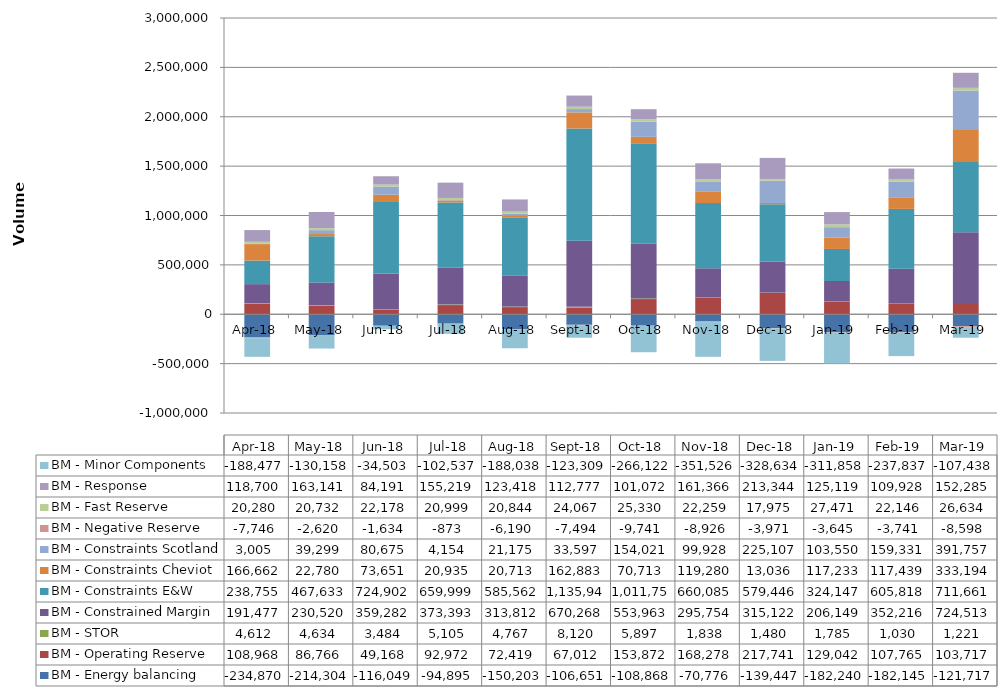
| Category | BM - Energy balancing | BM - Operating Reserve | BM - STOR | BM - Constrained Margin | BM - Constraints E&W | BM - Constraints Cheviot | BM - Constraints Scotland | BM - Negative Reserve | BM - Fast Reserve | BM - Response | BM - Minor Components |
|---|---|---|---|---|---|---|---|---|---|---|---|
| 2018-04-30 | -234870.387 | 108968.126 | 4612.492 | 191477.044 | 238755.119 | 166661.801 | 3005.42 | -7746.036 | 20279.763 | 118700.29 | -188477.184 |
| 2018-05-31 | -214304.063 | 86765.995 | 4633.733 | 230519.796 | 467633.481 | 22779.785 | 39299.047 | -2620.02 | 20731.99 | 163141.489 | -130157.519 |
| 2018-06-30 | -116048.566 | 49167.505 | 3483.667 | 359282.166 | 724901.997 | 73651.157 | 80675.399 | -1634.106 | 22177.568 | 84190.904 | -34503.133 |
| 2018-07-31 | -94894.686 | 92971.87 | 5105.001 | 373393.366 | 659999.264 | 20934.861 | 4154.324 | -872.907 | 20998.816 | 155218.766 | -102537.059 |
| 2018-08-31 | -150203.389 | 72419.187 | 4767.332 | 313812.042 | 585561.53 | 20713.21 | 21175.088 | -6190.289 | 20843.943 | 123418.023 | -188037.723 |
| 2018-09-30 | -106650.937 | 67011.687 | 8120.051 | 670268.276 | 1135941.418 | 162883.416 | 33597.499 | -7493.993 | 24067.017 | 112777.446 | -123308.914 |
| 2018-10-31 | -108868.249 | 153871.56 | 5897.409 | 553962.884 | 1011749.559 | 70712.512 | 154020.964 | -9740.767 | 25330.426 | 101072.225 | -266122.481 |
| 2018-11-30 | -70775.942 | 168277.989 | 1838.15 | 295754.003 | 660085.093 | 119280.325 | 99928.251 | -8926.221 | 22259.338 | 161365.801 | -351526.357 |
| 2018-12-31 | -139446.833 | 217741.361 | 1480.166 | 315121.985 | 579445.806 | 13035.56 | 225107.027 | -3970.527 | 17975.319 | 213343.815 | -328633.837 |
| 2019-01-31 | -182240.478 | 129042.436 | 1784.616 | 206149.134 | 324147.403 | 117233.269 | 103550.224 | -3645.28 | 27471.206 | 125119.311 | -311858.007 |
| 2019-02-28 | -182144.984 | 107765.434 | 1029.999 | 352215.631 | 605818.216 | 117439.318 | 159330.573 | -3740.555 | 22145.778 | 109928.339 | -237837.457 |
| 2019-03-31 | -121717.378 | 103717.09 | 1220.599 | 724512.501 | 711661.216 | 333194.259 | 391757.113 | -8598.135 | 26633.761 | 152284.716 | -107438.214 |